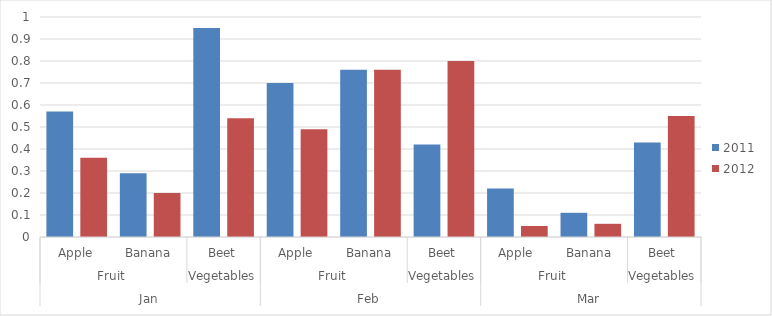
| Category | 2011 | 2012 |
|---|---|---|
| 0 | 0.57 | 0.36 |
| 1 | 0.29 | 0.2 |
| 2 | 0.95 | 0.54 |
| 3 | 0.7 | 0.49 |
| 4 | 0.76 | 0.76 |
| 5 | 0.42 | 0.8 |
| 6 | 0.22 | 0.05 |
| 7 | 0.11 | 0.06 |
| 8 | 0.43 | 0.55 |